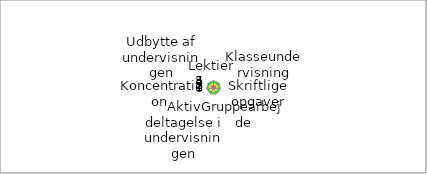
| Category | Series 5 | Series 4 | Series 3 | Series 2 | Series 1 | Series 0 |
|---|---|---|---|---|---|---|
| Lektier | 5 | 4 | 3 | 2 | 1 |  |
| Klasseundervisning | 5 | 4 | 3 | 2 | 1 |  |
| Skriftlige opgaver | 5 | 4 | 3 | 2 | 1 |  |
| Gruppearbejde | 5 | 4 | 3 | 2 | 1 |  |
| Aktiv deltagelse i undervisningen | 5 | 4 | 3 | 2 | 1 |  |
| Koncentration | 5 | 4 | 3 | 2 | 1 |  |
| Udbytte af undervisningen | 5 | 4 | 3 | 2 | 1 |  |